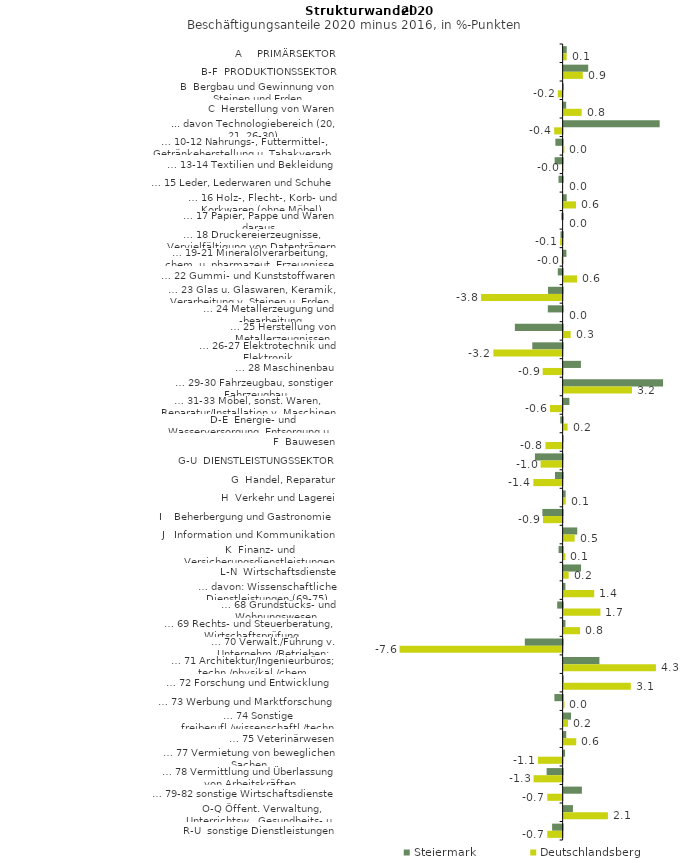
| Category | Steiermark | Deutschlandsberg |
|---|---|---|
| A     PRIMÄRSEKTOR | 0.145 | 0.141 |
| B-F  PRODUKTIONSSEKTOR | 1.14 | 0.89 |
| B  Bergbau und Gewinnung von Steinen und Erden | 0.008 | -0.225 |
| C  Herstellung von Waren | 0.118 | 0.836 |
| ... davon Technologiebereich (20, 21, 26-30) | 4.454 | -0.39 |
| … 10-12 Nahrungs-, Futtermittel-, Getränkeherstellung u. Tabakverarb. | -0.336 | 0.035 |
| … 13-14 Textilien und Bekleidung | -0.37 | -0.024 |
| … 15 Leder, Lederwaren und Schuhe | -0.191 | 0 |
| … 16 Holz-, Flecht-, Korb- und Korkwaren (ohne Möbel)  | 0.142 | 0.575 |
| … 17 Papier, Pappe und Waren daraus  | -0.062 | 0 |
| … 18 Druckereierzeugnisse, Vervielfältigung von Datenträgern | -0.099 | -0.119 |
| … 19-21 Mineralölverarbeitung, chem. u. pharmazeut. Erzeugnisse | 0.129 | -0.05 |
| … 22 Gummi- und Kunststoffwaren | -0.225 | 0.625 |
| … 23 Glas u. Glaswaren, Keramik, Verarbeitung v. Steinen u. Erden  | -0.677 | -3.781 |
| … 24 Metallerzeugung und -bearbeitung | -0.687 | 0 |
| … 25 Herstellung von Metallerzeugnissen  | -2.216 | 0.324 |
| … 26-27 Elektrotechnik und Elektronik | -1.407 | -3.211 |
| … 28 Maschinenbau | 0.802 | -0.926 |
| … 29-30 Fahrzeugbau, sonstiger Fahrzeugbau | 4.612 | 3.172 |
| … 31-33 Möbel, sonst. Waren, Reparatur/Installation v. Maschinen | 0.268 | -0.585 |
| D-E  Energie- und Wasserversorgung, Entsorgung u. Rückgewinnung | -0.111 | 0.184 |
| F  Bauwesen | -0.015 | -0.795 |
| G-U  DIENSTLEISTUNGSSEKTOR | -1.285 | -1.02 |
| G  Handel, Reparatur | -0.356 | -1.357 |
| H  Verkehr und Lagerei | 0.094 | 0.099 |
| I    Beherbergung und Gastronomie | -0.938 | -0.91 |
| J   Information und Kommunikation | 0.633 | 0.513 |
| K  Finanz- und Versicherungsdienstleistungen | -0.188 | 0.082 |
| L-N  Wirtschaftsdienste | 0.81 | 0.234 |
| … davon: Wissenschaftliche Dienstleistungen (69-75) | 0.083 | 1.419 |
| … 68 Grundstücks- und Wohnungswesen  | -0.253 | 1.705 |
| … 69 Rechts- und Steuerberatung, Wirtschaftsprüfung | 0.086 | 0.762 |
| … 70 Verwalt./Führung v. Unternehm./Betrieben; Unternehmensberat. | -1.753 | -7.563 |
| … 71 Architektur/Ingenieurbüros; techn./physikal./chem. Untersuchung | 1.66 | 4.28 |
| … 72 Forschung und Entwicklung  | 0.004 | 3.117 |
| … 73 Werbung und Marktforschung | -0.382 | 0.039 |
| … 74 Sonstige freiberufl./wissenschaftl./techn. Tätigkeiten | 0.344 | 0.2 |
| … 75 Veterinärwesen | 0.121 | 0.584 |
| … 77 Vermietung von beweglichen Sachen  | 0.066 | -1.147 |
| … 78 Vermittlung und Überlassung von Arbeitskräften | -0.742 | -1.347 |
| … 79-82 sonstige Wirtschaftsdienste | 0.848 | -0.711 |
| O-Q Öffent. Verwaltung, Unterrichtsw., Gesundheits- u. Sozialwesen | 0.432 | 2.055 |
| R-U  sonstige Dienstleistungen | -0.488 | -0.714 |